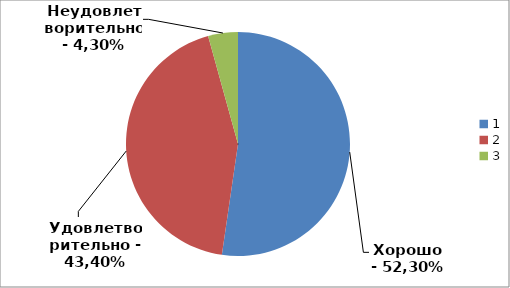
| Category | Series 0 | Хорошо | Удовлетворительно | Series 3 |
|---|---|---|---|---|
| 0 | 0.523 |  |  |  |
| 1 | 0.434 |  |  |  |
| 2 | 0.043 |  |  |  |